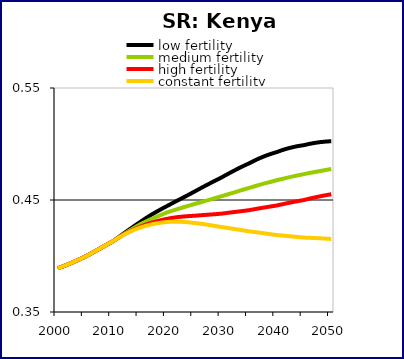
| Category | low fertility | medium fertility | high fertility | constant fertility |
|---|---|---|---|---|
| 2000.0 | 0.389 | 0.389 | 0.389 | 0.389 |
| 2001.0 | 0.391 | 0.391 | 0.391 | 0.391 |
| 2002.0 | 0.393 | 0.393 | 0.393 | 0.393 |
| 2003.0 | 0.395 | 0.395 | 0.395 | 0.395 |
| 2004.0 | 0.397 | 0.397 | 0.397 | 0.397 |
| 2005.0 | 0.399 | 0.399 | 0.399 | 0.399 |
| 2006.0 | 0.402 | 0.402 | 0.402 | 0.402 |
| 2007.0 | 0.405 | 0.405 | 0.405 | 0.405 |
| 2008.0 | 0.407 | 0.407 | 0.407 | 0.407 |
| 2009.0 | 0.41 | 0.41 | 0.41 | 0.41 |
| 2010.0 | 0.413 | 0.413 | 0.413 | 0.413 |
| 2011.0 | 0.416 | 0.416 | 0.416 | 0.416 |
| 2012.0 | 0.42 | 0.419 | 0.419 | 0.419 |
| 2013.0 | 0.423 | 0.422 | 0.422 | 0.421 |
| 2014.0 | 0.427 | 0.425 | 0.424 | 0.423 |
| 2015.0 | 0.43 | 0.428 | 0.426 | 0.425 |
| 2016.0 | 0.433 | 0.431 | 0.428 | 0.427 |
| 2017.0 | 0.437 | 0.433 | 0.43 | 0.428 |
| 2018.0 | 0.439 | 0.435 | 0.431 | 0.429 |
| 2019.0 | 0.442 | 0.437 | 0.432 | 0.43 |
| 2020.0 | 0.445 | 0.439 | 0.433 | 0.43 |
| 2021.0 | 0.447 | 0.44 | 0.434 | 0.431 |
| 2022.0 | 0.45 | 0.442 | 0.435 | 0.431 |
| 2023.0 | 0.452 | 0.444 | 0.435 | 0.43 |
| 2024.0 | 0.455 | 0.445 | 0.436 | 0.43 |
| 2025.0 | 0.458 | 0.446 | 0.436 | 0.429 |
| 2026.0 | 0.46 | 0.448 | 0.436 | 0.429 |
| 2027.0 | 0.463 | 0.449 | 0.437 | 0.428 |
| 2028.0 | 0.465 | 0.451 | 0.437 | 0.427 |
| 2029.0 | 0.468 | 0.452 | 0.437 | 0.427 |
| 2030.0 | 0.47 | 0.453 | 0.438 | 0.426 |
| 2031.0 | 0.473 | 0.455 | 0.438 | 0.425 |
| 2032.0 | 0.476 | 0.456 | 0.439 | 0.424 |
| 2033.0 | 0.478 | 0.458 | 0.44 | 0.424 |
| 2034.0 | 0.481 | 0.459 | 0.44 | 0.423 |
| 2035.0 | 0.483 | 0.461 | 0.441 | 0.422 |
| 2036.0 | 0.485 | 0.462 | 0.442 | 0.421 |
| 2037.0 | 0.488 | 0.464 | 0.443 | 0.421 |
| 2038.0 | 0.49 | 0.465 | 0.443 | 0.42 |
| 2039.0 | 0.491 | 0.466 | 0.444 | 0.419 |
| 2040.0 | 0.493 | 0.468 | 0.445 | 0.419 |
| 2041.0 | 0.494 | 0.469 | 0.446 | 0.418 |
| 2042.0 | 0.496 | 0.47 | 0.447 | 0.418 |
| 2043.0 | 0.497 | 0.471 | 0.448 | 0.417 |
| 2044.0 | 0.498 | 0.472 | 0.449 | 0.417 |
| 2045.0 | 0.499 | 0.473 | 0.45 | 0.416 |
| 2046.0 | 0.5 | 0.474 | 0.451 | 0.416 |
| 2047.0 | 0.501 | 0.475 | 0.452 | 0.416 |
| 2048.0 | 0.502 | 0.476 | 0.453 | 0.416 |
| 2049.0 | 0.502 | 0.477 | 0.454 | 0.416 |
| 2050.0 | 0.502 | 0.478 | 0.455 | 0.415 |